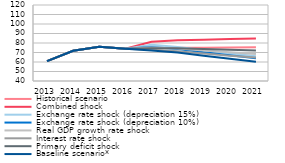
| Category | Historical scenario | Combined shock | Exchange rate shock (depreciation 15%) | Exchange rate shock (depreciation 10%) | Real GDP growth rate shock | Interest rate shock | Primary deficit shock | Baseline scenario* |
|---|---|---|---|---|---|---|---|---|
| 2013.0 | 60.969 | 60.969 | 60.969 | 60.969 | 60.969 | 60.969 | 60.969 | 60.969 |
| 2014.0 | 71.776 | 71.776 | 71.776 | 71.776 | 71.776 | 71.776 | 71.776 | 71.776 |
| 2015.0 | 75.92 | 75.92 | 75.92 | 75.92 | 75.92 | 75.92 | 75.92 | 75.92 |
| 2016.0 | 74.049 | 74.049 | 74.049 | 74.049 | 74.049 | 74.049 | 74.049 | 74.049 |
| 2017.0 | 74.347 | 81.373 | 78.106 | 75.832 | 75.147 | 72.765 | 74.555 | 72.155 |
| 2018.0 | 75.096 | 82.765 | 75.822 | 73.558 | 74.163 | 71.205 | 74.588 | 69.899 |
| 2019.0 | 75.094 | 83.358 | 72.539 | 70.289 | 72.159 | 68.87 | 73.813 | 66.651 |
| 2020.0 | 75.343 | 84.083 | 69.25 | 67.022 | 70.275 | 66.601 | 73.011 | 63.419 |
| 2021.0 | 75.53 | 84.677 | 66.07 | 63.865 | 68.446 | 64.621 | 72.091 | 60.3 |